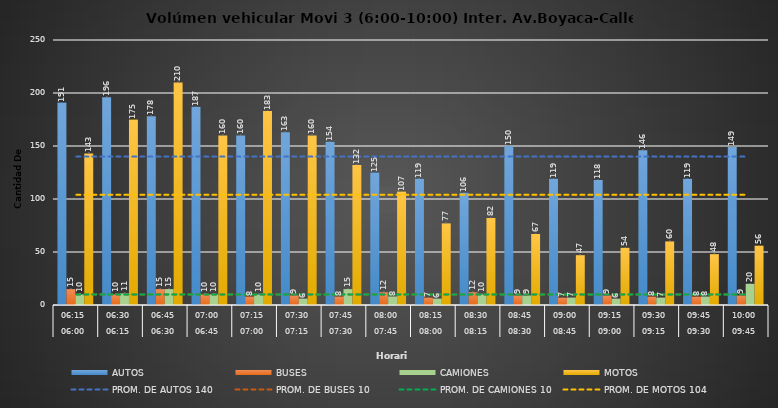
| Category | AUTOS | BUSES | CAMIONES | MOTOS |
|---|---|---|---|---|
| 0 | 191 | 15 | 10 | 143 |
| 1 | 196 | 10 | 11 | 175 |
| 2 | 178 | 15 | 15 | 210 |
| 3 | 187 | 10 | 10 | 160 |
| 4 | 160 | 8 | 10 | 183 |
| 5 | 163 | 9 | 6 | 160 |
| 6 | 154 | 8 | 15 | 132 |
| 7 | 125 | 12 | 8 | 107 |
| 8 | 119 | 7 | 6 | 77 |
| 9 | 106 | 12 | 10 | 82 |
| 10 | 150 | 9 | 9 | 67 |
| 11 | 119 | 7 | 7 | 47 |
| 12 | 118 | 9 | 6 | 54 |
| 13 | 146 | 8 | 7 | 60 |
| 14 | 119 | 8 | 8 | 48 |
| 15 | 149 | 9 | 20 | 56 |